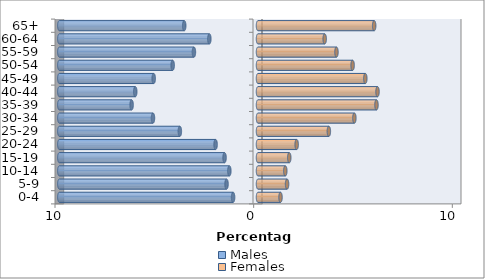
| Category | Males | Females |
|---|---|---|
| 0-4 | -1.254 | 1.133 |
| 5-9 | -1.584 | 1.463 |
| 10-14 | -1.442 | 1.374 |
| 15-19 | -1.684 | 1.573 |
| 20-24 | -2.135 | 1.946 |
| 25-29 | -3.934 | 3.567 |
| 30-34 | -5.287 | 4.852 |
| 35-39 | -6.362 | 5.963 |
| 40-44 | -6.179 | 6.016 |
| 45-49 | -5.25 | 5.402 |
| 50-54 | -4.296 | 4.762 |
| 55-59 | -3.226 | 3.949 |
| 60-64 | -2.449 | 3.357 |
| 65+ | -3.713 | 5.848 |